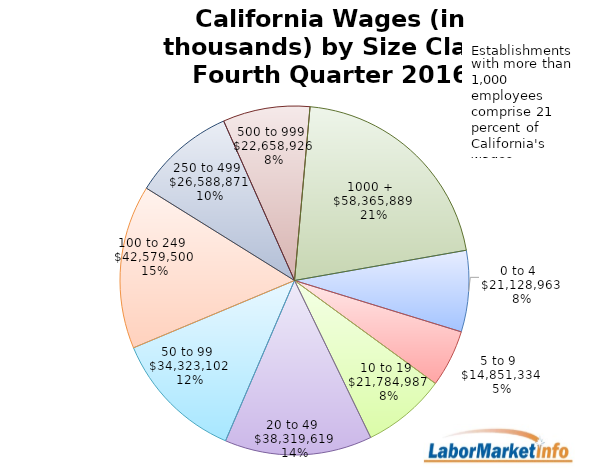
| Category | Series 0 |
|---|---|
| 0 to 4   | 21128963.254 |
| 5 to 9   | 14851334.434 |
| 10 to 19   | 21784987.009 |
| 20 to 49   | 38319619.442 |
| 50 to 99   | 34323101.859 |
| 100 to 249   | 42579499.763 |
| 250 to 499   | 26588871.294 |
| 500 to 999   | 22658925.642 |
| 1000 +   | 58365888.802 |